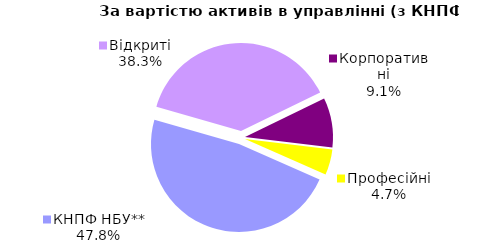
| Category | Series 0 |
|---|---|
| Відкриті | 1139.809 |
| Корпоративні | 270.715 |
| Професійні | 139.749 |
| КНПФ НБУ** | 1422.427 |